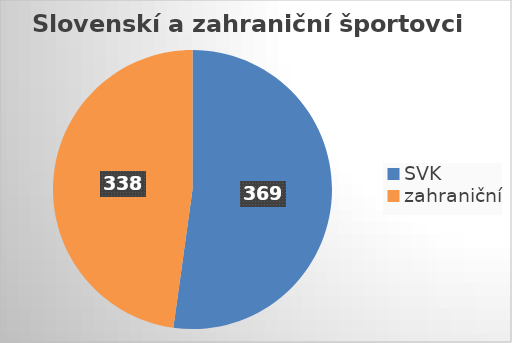
| Category | Slovenskí a zahraniční športovci |
|---|---|
| SVK | 369 |
| zahraniční | 338 |